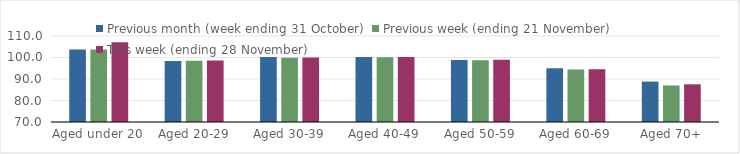
| Category | Previous month (week ending 31 October) | Previous week (ending 21 November) | This week (ending 28 November) |
|---|---|---|---|
| Aged under 20 | 103.69 | 103.76 | 107.12 |
| Aged 20-29 | 98.43 | 98.48 | 98.61 |
| Aged 30-39 | 100.26 | 99.88 | 99.99 |
| Aged 40-49 | 100.22 | 100.09 | 100.19 |
| Aged 50-59 | 98.89 | 98.74 | 98.91 |
| Aged 60-69 | 94.96 | 94.46 | 94.59 |
| Aged 70+ | 88.8 | 87 | 87.54 |